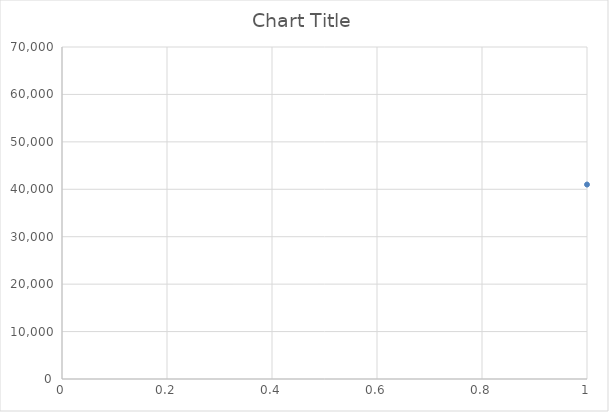
| Category | Series 0 |
|---|---|
| 0 | 41000 |
| 1 | 41500 |
| 2 | 41000 |
| 3 | 50500 |
| 4 | 31800 |
| 5 | 31400 |
| 6 | 31000 |
| 7 | 31800 |
| 8 | 42000 |
| 9 | 43500 |
| 10 | 31600 |
| 11 | 31600 |
| 12 | 31000 |
| 13 | 31600 |
| 14 | 31800 |
| 15 | 31400 |
| 16 | 31000 |
| 17 | 31800 |
| 18 | 42500 |
| 19 | 44500 |
| 20 | 42000 |
| 21 | 43500 |
| 22 | 9800 |
| 23 | 13000 |
| 24 | 19000 |
| 25 | 9000 |
| 26 | 12200 |
| 27 | 18000 |
| 28 | 24000 |
| 29 | 22000 |
| 30 | 25000 |
| 31 | 28600 |
| 32 | 45000 |
| 33 | 45000 |
| 34 | 48000 |
| 35 | 66000 |
| 36 | 42000 |
| 37 | 42000 |
| 38 | 42000 |
| 39 | 54000 |
| 40 | 66000 |
| 41 | 13600 |
| 42 | 21600 |
| 43 | 38000 |
| 44 | 38000 |
| 45 | 11000 |
| 46 | 13000 |
| 47 | 18000 |
| 48 | 21000 |
| 49 | 8700 |
| 50 | 8700 |
| 51 | 10900 |
| 52 | 10900 |
| 53 | 13600 |
| 54 | 13600 |
| 55 | 18000 |
| 56 | 18540 |
| 57 | 20300 |
| 58 | 20300 |
| 59 | 10900 |
| 60 | 14400 |
| 61 | 18000 |
| 62 | 21600 |
| 63 | 27600 |
| 64 | 26000 |
| 65 | 38000 |
| 66 | 38000 |
| 67 | 24000 |
| 68 | 10000 |
| 69 | 12000 |
| 70 | 9800 |
| 71 | 11800 |
| 72 | 35200 |
| 73 | 9800 |
| 74 | 9800 |
| 75 | 12000 |
| 76 | 18000 |
| 77 | 25000 |
| 78 | 23600 |
| 79 | 24000 |
| 80 | 23800 |
| 81 | 24000 |
| 82 | 24000 |
| 83 | 24000 |
| 84 | 24000 |
| 85 | 23800 |
| 86 | 23800 |
| 87 | 23600 |
| 88 | 23200 |
| 89 | 23200 |
| 90 | 23000 |
| 91 | 22800 |
| 92 | 22800 |
| 93 | 22600 |
| 94 | 24000 |
| 95 | 24000 |
| 96 | 24000 |
| 97 | 24000 |
| 98 | 23400 |
| 99 | 23400 |
| 100 | 23600 |
| 101 | 23400 |
| 102 | 23400 |
| 103 | 23200 |
| 104 | 23200 |
| 105 | 23400 |
| 106 | 24000 |
| 107 | 23800 |
| 108 | 23800 |
| 109 | 23800 |
| 110 | 23800 |
| 111 | 23600 |
| 112 | 23400 |
| 113 | 23400 |
| 114 | 23200 |
| 115 | 23600 |
| 116 | 23400 |
| 117 | 23400 |
| 118 | 23200 |
| 119 | 23000 |
| 120 | 23000 |
| 121 | 23000 |
| 122 | 23000 |
| 123 | 23000 |
| 124 | 23000 |
| 125 | 23000 |
| 126 | 23000 |
| 127 | 22800 |
| 128 | 22800 |
| 129 | 22800 |
| 130 | 22800 |
| 131 | 22800 |
| 132 | 22800 |
| 133 | 23000 |
| 134 | 23000 |
| 135 | 23000 |
| 136 | 23000 |
| 137 | 23000 |
| 138 | 23000 |
| 139 | 23400 |
| 140 | 23400 |
| 141 | 23400 |
| 142 | 23400 |
| 143 | 23200 |
| 144 | 23200 |
| 145 | 23200 |
| 146 | 23000 |
| 147 | 23000 |
| 148 | 23400 |
| 149 | 23200 |
| 150 | 23200 |
| 151 | 23200 |
| 152 | 23200 |
| 153 | 23200 |
| 154 | 23200 |
| 155 | 23200 |
| 156 | 23000 |
| 157 | 23200 |
| 158 | 23000 |
| 159 | 23000 |
| 160 | 23200 |
| 161 | 23200 |
| 162 | 33400 |
| 163 | 35404 |
| 164 | 35738 |
| 165 | 33400 |
| 166 | 35000 |
| 167 | 33600 |
| 168 | 33200 |
| 169 | 33000 |
| 170 | 32800 |
| 171 | 34200 |
| 172 | 34000 |
| 173 | 33600 |
| 174 | 35200 |
| 175 | 34800 |
| 176 | 34600 |
| 177 | 33800 |
| 178 | 33600 |
| 179 | 33800 |
| 180 | 33600 |
| 181 | 33400 |
| 182 | 34000 |
| 183 | 34200 |
| 184 | 34000 |
| 185 | 33800 |
| 186 | 34000 |
| 187 | 34000 |
| 188 | 33800 |
| 189 | 34000 |
| 190 | 34000 |
| 191 | 33600 |
| 192 | 33600 |
| 193 | 33600 |
| 194 | 32800 |
| 195 | 33600 |
| 196 | 33600 |
| 197 | 33200 |
| 198 | 33200 |
| 199 | 33200 |
| 200 | 33200 |
| 201 | 33200 |
| 202 | 33200 |
| 203 | 34200 |
| 204 | 34200 |
| 205 | 33800 |
| 206 | 33800 |
| 207 | 33800 |
| 208 | 34000 |
| 209 | 33800 |
| 210 | 33800 |
| 211 | 33800 |
| 212 | 33800 |
| 213 | 33800 |
| 214 | 34000 |
| 215 | 34000 |
| 216 | 34000 |
| 217 | 34000 |
| 218 | 33800 |
| 219 | 33800 |
| 220 | 33800 |
| 221 | 33800 |
| 222 | 33800 |
| 223 | 33800 |
| 224 | 33800 |
| 225 | 45500 |
| 226 | 46500 |
| 227 | 46000 |
| 228 | 45500 |
| 229 | 45500 |
| 230 | 46000 |
| 231 | 46000 |
| 232 | 46000 |
| 233 | 55500 |
| 234 | 10000 |
| 235 | 12000 |
| 236 | 19000 |
| 237 | 19000 |
| 238 | 36000 |
| 239 | 36000 |
| 240 | 48000 |
| 241 | 48000 |
| 242 | 23000 |
| 243 | 23000 |
| 244 | 28000 |
| 245 | 28000 |
| 246 | 18000 |
| 247 | 18000 |
| 248 | 23600 |
| 249 | 24000 |
| 250 | 23800 |
| 251 | 24000 |
| 252 | 24000 |
| 253 | 24000 |
| 254 | 24000 |
| 255 | 23800 |
| 256 | 23800 |
| 257 | 23600 |
| 258 | 23200 |
| 259 | 23200 |
| 260 | 23000 |
| 261 | 22800 |
| 262 | 22800 |
| 263 | 22600 |
| 264 | 24000 |
| 265 | 24000 |
| 266 | 24000 |
| 267 | 24000 |
| 268 | 23400 |
| 269 | 23400 |
| 270 | 23600 |
| 271 | 23400 |
| 272 | 23400 |
| 273 | 23200 |
| 274 | 23200 |
| 275 | 23400 |
| 276 | 24000 |
| 277 | 23800 |
| 278 | 23800 |
| 279 | 23800 |
| 280 | 23800 |
| 281 | 23600 |
| 282 | 23400 |
| 283 | 23400 |
| 284 | 23200 |
| 285 | 23600 |
| 286 | 23400 |
| 287 | 23400 |
| 288 | 23200 |
| 289 | 23000 |
| 290 | 23000 |
| 291 | 23000 |
| 292 | 23000 |
| 293 | 23000 |
| 294 | 23000 |
| 295 | 23000 |
| 296 | 23000 |
| 297 | 22800 |
| 298 | 22800 |
| 299 | 22800 |
| 300 | 22800 |
| 301 | 22800 |
| 302 | 22800 |
| 303 | 23000 |
| 304 | 23000 |
| 305 | 23000 |
| 306 | 23000 |
| 307 | 23000 |
| 308 | 23000 |
| 309 | 23400 |
| 310 | 23400 |
| 311 | 23400 |
| 312 | 23400 |
| 313 | 23200 |
| 314 | 23200 |
| 315 | 23200 |
| 316 | 23000 |
| 317 | 23000 |
| 318 | 23400 |
| 319 | 23200 |
| 320 | 23200 |
| 321 | 23200 |
| 322 | 23200 |
| 323 | 23200 |
| 324 | 23200 |
| 325 | 23200 |
| 326 | 23000 |
| 327 | 23200 |
| 328 | 23000 |
| 329 | 23000 |
| 330 | 23200 |
| 331 | 23200 |
| 332 | 23200 |
| 333 | 33400 |
| 334 | 35404 |
| 335 | 35738 |
| 336 | 33400 |
| 337 | 35000 |
| 338 | 33600 |
| 339 | 33200 |
| 340 | 33000 |
| 341 | 32800 |
| 342 | 34200 |
| 343 | 34000 |
| 344 | 33600 |
| 345 | 35200 |
| 346 | 34800 |
| 347 | 34600 |
| 348 | 33800 |
| 349 | 33600 |
| 350 | 33800 |
| 351 | 33600 |
| 352 | 33400 |
| 353 | 34000 |
| 354 | 34200 |
| 355 | 34000 |
| 356 | 33800 |
| 357 | 34000 |
| 358 | 34000 |
| 359 | 33800 |
| 360 | 34000 |
| 361 | 34000 |
| 362 | 33600 |
| 363 | 33600 |
| 364 | 33600 |
| 365 | 32800 |
| 366 | 33600 |
| 367 | 33600 |
| 368 | 33200 |
| 369 | 33200 |
| 370 | 33200 |
| 371 | 33200 |
| 372 | 33200 |
| 373 | 33200 |
| 374 | 34200 |
| 375 | 34200 |
| 376 | 33800 |
| 377 | 33800 |
| 378 | 33800 |
| 379 | 34000 |
| 380 | 33800 |
| 381 | 33800 |
| 382 | 33800 |
| 383 | 33800 |
| 384 | 33800 |
| 385 | 34000 |
| 386 | 34000 |
| 387 | 34000 |
| 388 | 34000 |
| 389 | 33800 |
| 390 | 33800 |
| 391 | 33800 |
| 392 | 33800 |
| 393 | 33800 |
| 394 | 33800 |
| 395 | 33800 |
| 396 | 45500 |
| 397 | 46500 |
| 398 | 46000 |
| 399 | 45500 |
| 400 | 45500 |
| 401 | 46000 |
| 402 | 46000 |
| 403 | 46000 |
| 404 | 55500 |
| 405 | 12000 |
| 406 | 12000 |
| 407 | 12000 |
| 408 | 12000 |
| 409 | 19000 |
| 410 | 19000 |
| 411 | 19000 |
| 412 | 19000 |
| 413 | 0 |
| 414 | 0 |
| 415 | 0 |
| 416 | 0 |
| 417 | 24000 |
| 418 | 24000 |
| 419 | 24000 |
| 420 | 24000 |
| 421 | 24000 |
| 422 | 11800 |
| 423 | 10900 |
| 424 | 18000 |
| 425 | 18000 |
| 426 | 18000 |
| 427 | 18000 |
| 428 | 18000 |
| 429 | 10000 |
| 430 | 12000 |
| 431 | 55500 |
| 432 | 33400 |
| 433 | 45500 |
| 434 | 23600 |
| 435 | 9000 |
| 436 | 13000 |
| 437 | 19000 |
| 438 | 10900 |
| 439 | 11800 |
| 440 | 24000 |
| 441 | 18000 |
| 442 | 24000 |
| 443 | 10000 |
| 444 | 12000 |
| 445 | 9800 |
| 446 | 11800 |
| 447 | 21600 |
| 448 | 16200 |
| 449 | 10000 |
| 450 | 13500 |
| 451 | 24000 |
| 452 | 24000 |
| 453 | 24000 |
| 454 | 21600 |
| 455 | 18000 |
| 456 | 18900 |
| 457 | 24000 |
| 458 | 18940 |
| 459 | 24000 |
| 460 | 23600 |
| 461 | 35000 |
| 462 | 45500 |
| 463 | 50000 |
| 464 | 23400 |
| 465 | 12000 |
| 466 | 16000 |
| 467 | 18000 |
| 468 | 12000 |
| 469 | 14400 |
| 470 | 18000 |
| 471 | 21600 |
| 472 | 25400 |
| 473 | 18295 |
| 474 | 18056 |
| 475 | 13679 |
| 476 | 10089 |
| 477 | 10942 |
| 478 | 10000 |
| 479 | 13500 |
| 480 | 16200 |
| 481 | 21600 |
| 482 | 24000 |
| 483 | 10000 |
| 484 | 12000 |
| 485 | 9800 |
| 486 | 11800 |
| 487 | 9800 |
| 488 | 11800 |
| 489 | 18000 |
| 490 | 25000 |
| 491 | 11000 |
| 492 | 13000 |
| 493 | 8806.37 |